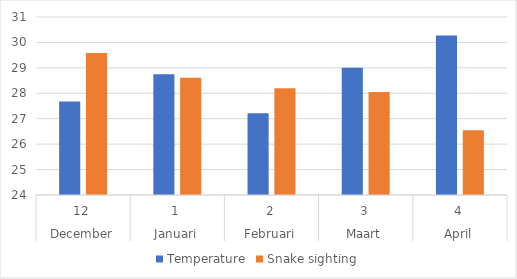
| Category | Temperature | Snake sighting |
|---|---|---|
| 0 | 27.676 | 29.583 |
| 1 | 28.745 | 28.608 |
| 2 | 27.218 | 28.2 |
| 3 | 29.008 | 28.05 |
| 4 | 30.272 | 26.55 |